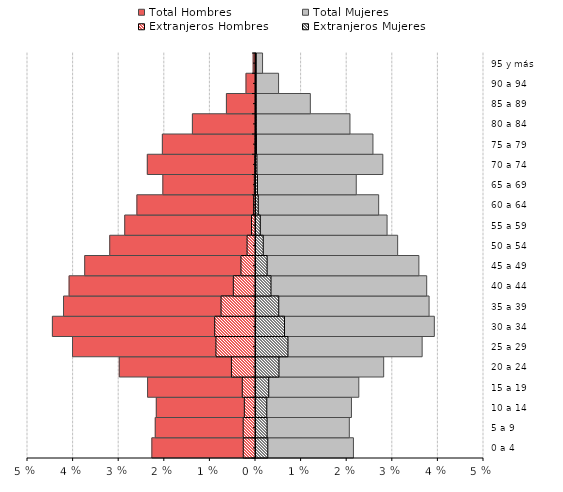
| Category | Total Hombres | Total Mujeres | Extranjeros Hombres | Extranjeros Mujeres |
|---|---|---|---|---|
| 0 a 4 | -0.023 | 0.021 | -0.003 | 0.003 |
| 5 a 9 | -0.022 | 0.02 | -0.003 | 0.002 |
| 10 a 14 | -0.022 | 0.021 | -0.002 | 0.002 |
| 15 a 19 | -0.024 | 0.023 | -0.003 | 0.003 |
| 20 a 24 | -0.03 | 0.028 | -0.005 | 0.005 |
| 25 a 29 | -0.04 | 0.036 | -0.009 | 0.007 |
| 30 a 34 | -0.045 | 0.039 | -0.009 | 0.006 |
| 35 a 39 | -0.042 | 0.038 | -0.008 | 0.005 |
| 40 a 44 | -0.041 | 0.037 | -0.005 | 0.003 |
| 45 a 49 | -0.037 | 0.036 | -0.003 | 0.002 |
| 50 a 54 | -0.032 | 0.031 | -0.002 | 0.002 |
| 55 a 59 | -0.029 | 0.029 | -0.001 | 0.001 |
| 60 a 64 | -0.026 | 0.027 | 0 | 0 |
| 65 a 69 | -0.02 | 0.022 | 0 | 0 |
| 70 a 74 | -0.024 | 0.028 | 0 | 0 |
| 75 a 79 | -0.02 | 0.026 | 0 | 0 |
| 80 a 84 | -0.014 | 0.021 | 0 | 0 |
| 85 a 89 | -0.006 | 0.012 | 0 | 0 |
| 90 a 94 | -0.002 | 0.005 | 0 | 0 |
| 95 y más | -0.001 | 0.001 | 0 | 0 |